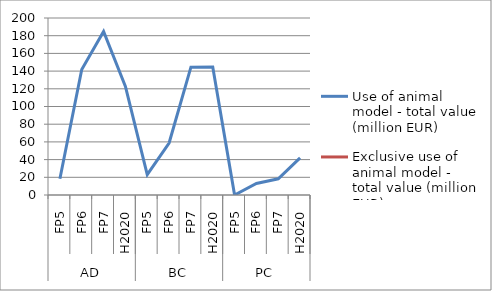
| Category | Use of animal model - total value (million EUR)   | Exclusive use of animal model - total value (million EUR) |
|---|---|---|
| 0 | 18.397 | 0 |
| 1 | 141.83 | 0 |
| 2 | 184.744 | 0 |
| 3 | 122.676 | 0 |
| 4 | 22.983 | 0 |
| 5 | 58.777 | 0 |
| 6 | 144.458 | 0 |
| 7 | 144.501 | 0 |
| 8 | 0 | 0 |
| 9 | 13.077 | 0 |
| 10 | 18.258 | 0 |
| 11 | 41.871 | 0 |